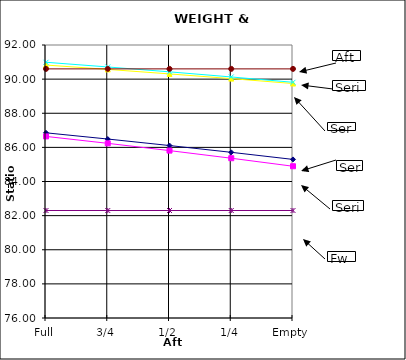
| Category | Series 0 | Series 1 | Series 2 | Series 3 | Series 4 | Series 5 |
|---|---|---|---|---|---|---|
| Full | 86.853 | 86.643 | 90.826 | 90.988 | 82.3 | 90.6 |
| 3/4 | 86.488 | 86.236 | 90.571 | 90.713 | 82.3 | 90.6 |
| 1/2 | 86.108 | 85.811 | 90.306 | 90.426 | 82.3 | 90.6 |
| 1/4 | 85.71 | 85.364 | 90.03 | 90.127 | 82.3 | 90.6 |
| Empty | 85.294 | 84.894 | 89.743 | 89.814 | 82.3 | 90.6 |